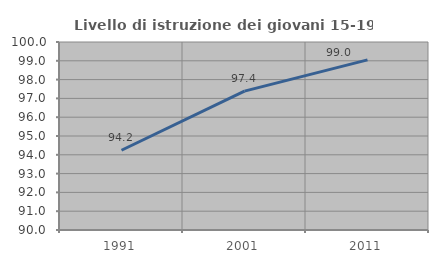
| Category | Livello di istruzione dei giovani 15-19 anni |
|---|---|
| 1991.0 | 94.241 |
| 2001.0 | 97.386 |
| 2011.0 | 99.048 |